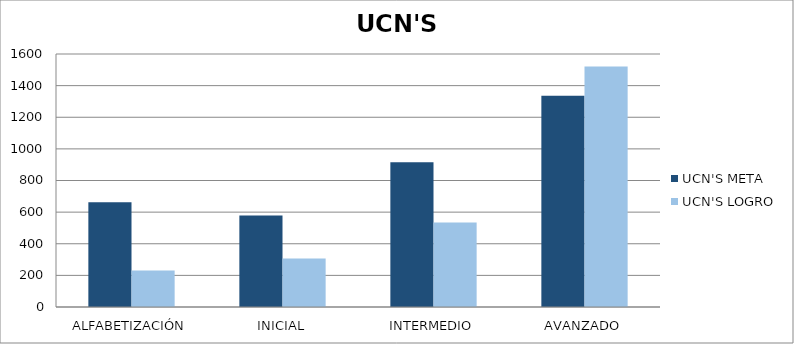
| Category | UCN'S |
|---|---|
| ALFABETIZACIÓN | 231 |
| INICIAL | 307 |
| INTERMEDIO | 534 |
| AVANZADO | 1521 |